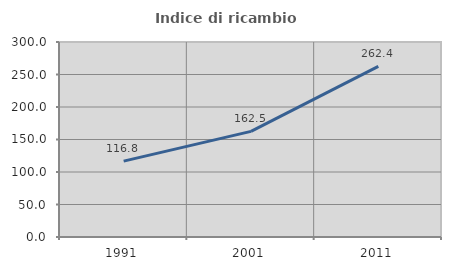
| Category | Indice di ricambio occupazionale  |
|---|---|
| 1991.0 | 116.765 |
| 2001.0 | 162.478 |
| 2011.0 | 262.424 |